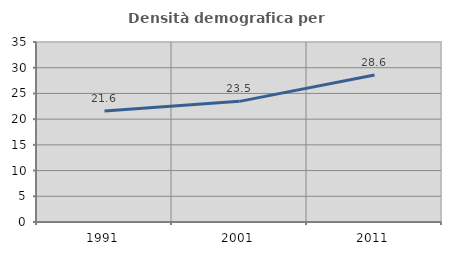
| Category | Densità demografica |
|---|---|
| 1991.0 | 21.576 |
| 2001.0 | 23.46 |
| 2011.0 | 28.597 |